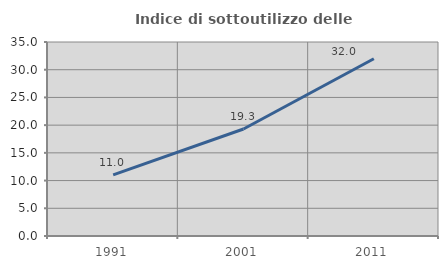
| Category | Indice di sottoutilizzo delle abitazioni  |
|---|---|
| 1991.0 | 11.02 |
| 2001.0 | 19.309 |
| 2011.0 | 31.985 |